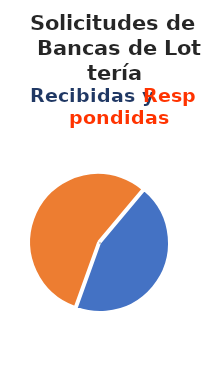
| Category | Series 0 |
|---|---|
| 0 | 67 |
| 1 | 84 |